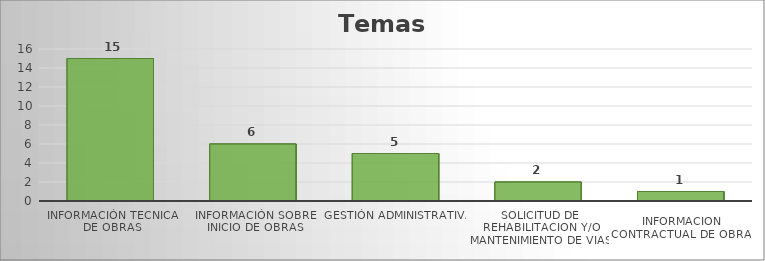
| Category | Series 0 |
|---|---|
| INFORMACIÓN TECNICA DE OBRAS | 15 |
| INFORMACIÓN SOBRE INICIO DE OBRAS | 6 |
| GESTIÓN ADMINISTRATIVA | 5 |
| SOLICITUD DE REHABILITACION Y/O MANTENIMIENTO DE VIAS | 2 |
| INFORMACIÓN CONTRACTUAL DE OBRAS | 1 |